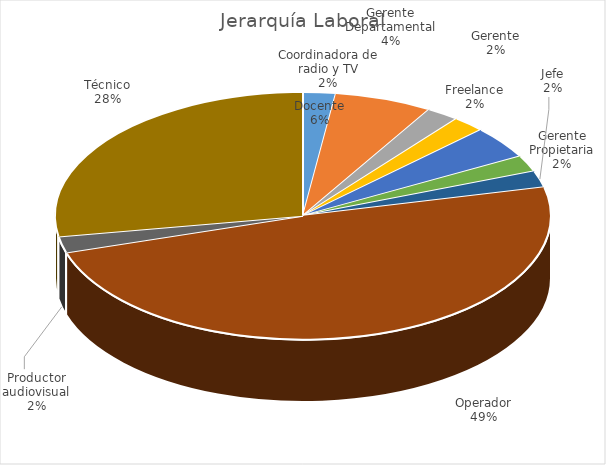
| Category | Total |
|---|---|
| Coordinadora de radio y TV | 1 |
| Docente | 3 |
| Freelance | 1 |
| Gerente | 1 |
| Gerente Departamental | 2 |
| Gerente Propietaria | 1 |
| Jefe | 1 |
| Operador | 23 |
| Productor audiovisual | 1 |
| Técnico | 13 |